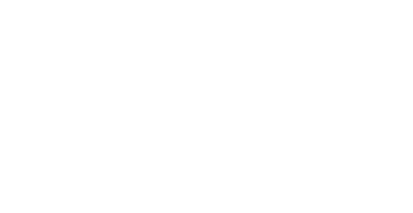
| Category | Plačana glavnica | Plačane obresti |
|---|---|---|
| 2021 | 380.494 | 270.663 |
| 2022 | 1173.53 | 779.943 |
| 2023 | 2011.299 | 1244.49 |
| 2024 | 2896.325 | 1661.779 |
| 2025 | 3831.273 | 2029.146 |
| 2026 | 4818.959 | 2343.775 |
| 2027 | 5862.359 | 2602.69 |
| 2028 | 6964.615 | 2802.75 |
| 2029 | 8129.047 | 2940.634 |
| 2030 | 9359.162 | 3012.834 |
| 2031 | 10000 | 3023.153 |